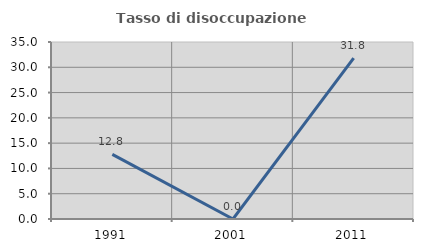
| Category | Tasso di disoccupazione giovanile  |
|---|---|
| 1991.0 | 12.766 |
| 2001.0 | 0 |
| 2011.0 | 31.818 |